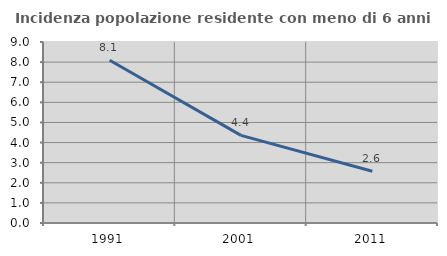
| Category | Incidenza popolazione residente con meno di 6 anni |
|---|---|
| 1991.0 | 8.096 |
| 2001.0 | 4.359 |
| 2011.0 | 2.575 |